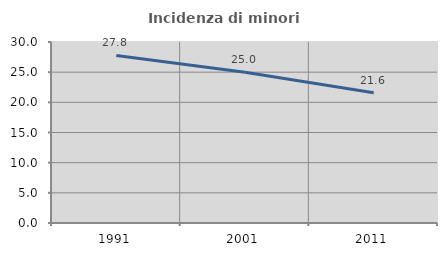
| Category | Incidenza di minori stranieri |
|---|---|
| 1991.0 | 27.778 |
| 2001.0 | 25 |
| 2011.0 | 21.605 |